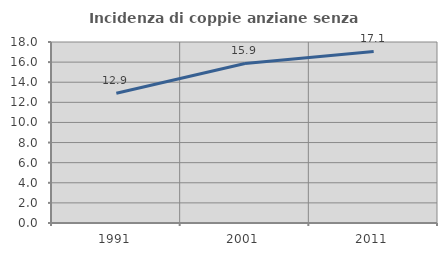
| Category | Incidenza di coppie anziane senza figli  |
|---|---|
| 1991.0 | 12.906 |
| 2001.0 | 15.866 |
| 2011.0 | 17.064 |